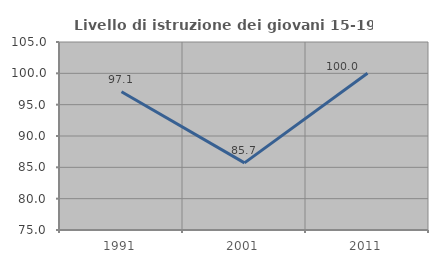
| Category | Livello di istruzione dei giovani 15-19 anni |
|---|---|
| 1991.0 | 97.059 |
| 2001.0 | 85.714 |
| 2011.0 | 100 |